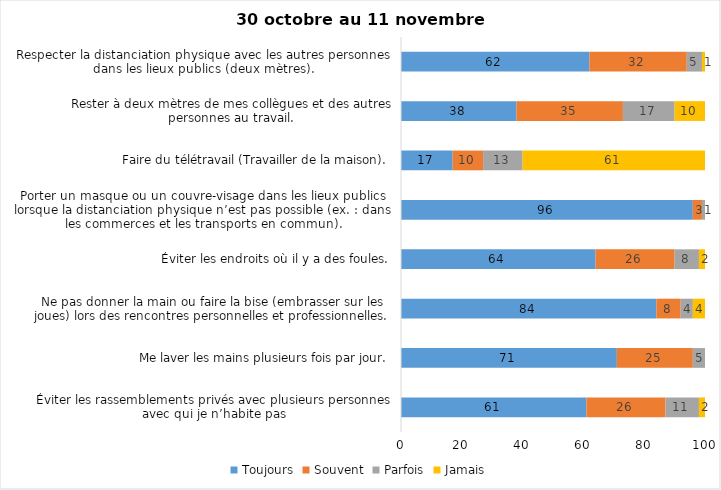
| Category | Toujours | Souvent | Parfois | Jamais |
|---|---|---|---|---|
| Éviter les rassemblements privés avec plusieurs personnes avec qui je n’habite pas | 61 | 26 | 11 | 2 |
| Me laver les mains plusieurs fois par jour. | 71 | 25 | 5 | 0 |
| Ne pas donner la main ou faire la bise (embrasser sur les joues) lors des rencontres personnelles et professionnelles. | 84 | 8 | 4 | 4 |
| Éviter les endroits où il y a des foules. | 64 | 26 | 8 | 2 |
| Porter un masque ou un couvre-visage dans les lieux publics lorsque la distanciation physique n’est pas possible (ex. : dans les commerces et les transports en commun). | 96 | 3 | 1 | 0 |
| Faire du télétravail (Travailler de la maison). | 17 | 10 | 13 | 61 |
| Rester à deux mètres de mes collègues et des autres personnes au travail. | 38 | 35 | 17 | 10 |
| Respecter la distanciation physique avec les autres personnes dans les lieux publics (deux mètres). | 62 | 32 | 5 | 1 |